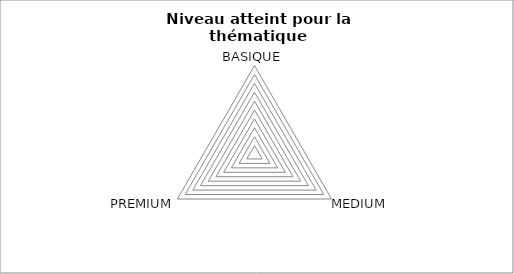
| Category | Series 0 |
|---|---|
| BASIQUE | 0 |
| MEDIUM | 0 |
| PREMIUM | 0 |